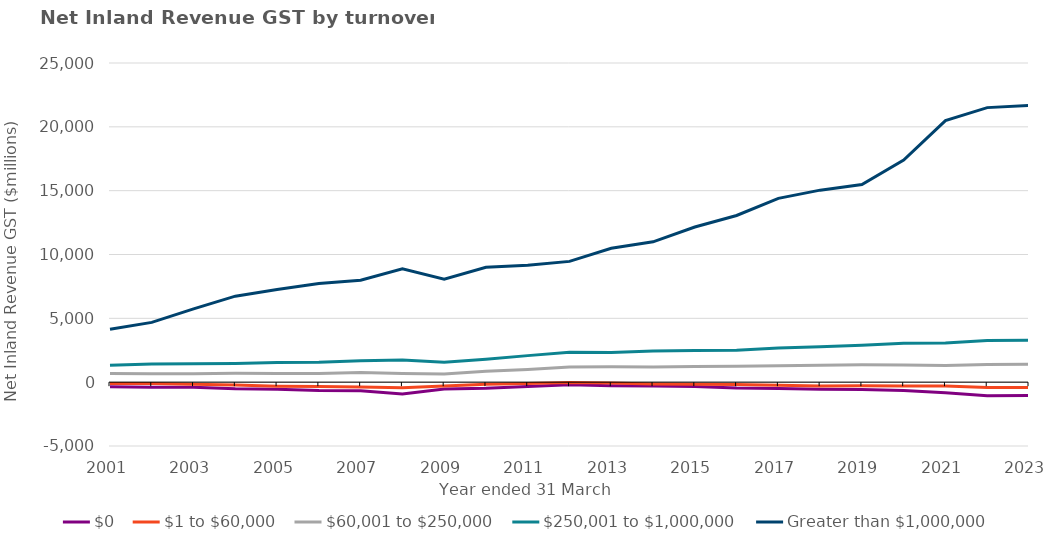
| Category | $0 | $1 to $60,000 | $60,001 to $250,000 | $250,001 to $1,000,000 | Greater than $1,000,000 |
|---|---|---|---|---|---|
| 2001-03-01 | -367.5 | -95.73 | 685.14 | 1331.95 | 4147.87 |
| 2002-03-01 | -401.62 | -113.72 | 662.97 | 1427.36 | 4684.24 |
| 2003-03-01 | -407.62 | -167.9 | 656.06 | 1445.31 | 5744.48 |
| 2004-03-01 | -517.89 | -230.01 | 701.04 | 1464.72 | 6734.88 |
| 2005-03-01 | -551.45 | -315.71 | 687.13 | 1548.14 | 7251.4 |
| 2006-03-01 | -645.25 | -342.11 | 688.25 | 1566.81 | 7724.78 |
| 2007-03-01 | -664.1 | -369.97 | 756.31 | 1671.56 | 7990.99 |
| 2008-03-01 | -926.5 | -432.15 | 672.19 | 1745.22 | 8883.79 |
| 2009-03-01 | -541.86 | -296.69 | 632.67 | 1561.47 | 8071.88 |
| 2010-03-01 | -480.55 | -166.9 | 847.32 | 1798.78 | 8994.29 |
| 2011-03-01 | -343.74 | -106.78 | 996.67 | 2079.4 | 9152.53 |
| 2012-03-01 | -210.19 | -17.85 | 1186.96 | 2339.89 | 9461.19 |
| 2013-03-01 | -282.96 | -64.26 | 1200.36 | 2329.61 | 10493.65 |
| 2014-03-01 | -302.83 | -134.53 | 1193.26 | 2446.87 | 10992.29 |
| 2015-03-01 | -347.39 | -171.32 | 1229.08 | 2487.7 | 12154.41 |
| 2016-03-01 | -466.4 | -190.13 | 1243.85 | 2495.87 | 13056.73 |
| 2017-03-01 | -487.9 | -249.8 | 1286.5 | 2684.5 | 14398.6 |
| 2018-03-01 | -558.553 | -290.713 | 1318.243 | 2768.994 | 15040.339 |
| 2019-03-01 | -571.805 | -287.722 | 1358.407 | 2891.635 | 15484.661 |
| 2020-03-01 | -656.244 | -304.305 | 1347.765 | 3039.94 | 17391.693 |
| 2021-03-01 | -836.354 | -307.113 | 1298.771 | 3068.141 | 20483.383 |
| 2022-03-01 | -1070.374 | -409.488 | 1386.788 | 3269.2 | 21504.597 |
| 2023-03-01 | -1053.541 | -419.683 | 1399.731 | 3274.448 | 21670.422 |